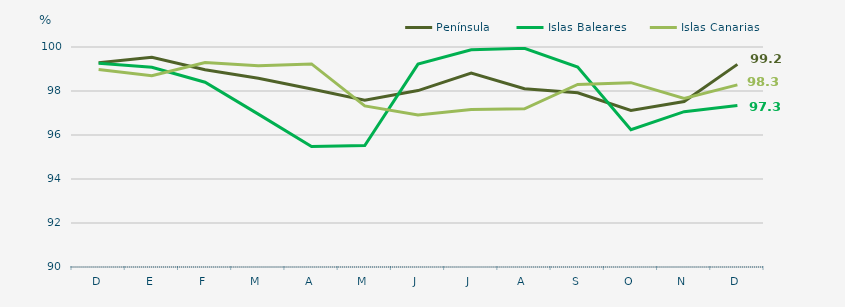
| Category | Península | Islas Baleares | Islas Canarias |
|---|---|---|---|
| D | 99.28 | 99.26 | 98.98 |
| E | 99.53 | 99.08 | 98.69 |
| F | 98.97 | 98.4 | 99.29 |
| M | 98.58 | 96.95 | 99.15 |
| A | 98.09 | 95.48 | 99.23 |
| M | 97.58 | 95.52 | 97.32 |
| J | 98.02 | 99.22 | 96.91 |
| J | 98.81 | 99.87 | 97.16 |
| A | 98.1 | 99.94 | 97.19 |
| S | 97.92 | 99.09 | 98.3 |
| O | 97.12 | 96.24 | 98.38 |
| N | 97.52 | 97.06 | 97.66 |
| D | 99.21 | 97.34 | 98.28 |